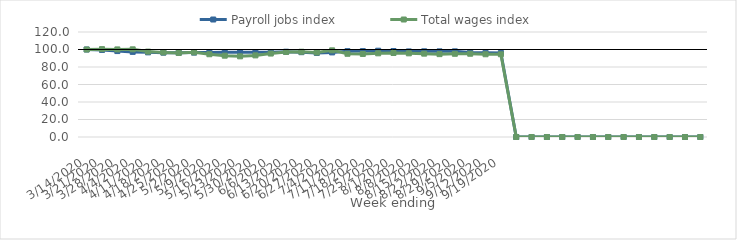
| Category | Payroll jobs index | Total wages index |
|---|---|---|
| 14/03/2020 | 100 | 100 |
| 21/03/2020 | 99.487 | 100.417 |
| 28/03/2020 | 98.197 | 100.093 |
| 04/04/2020 | 97.277 | 100.192 |
| 11/04/2020 | 96.745 | 97.6 |
| 18/04/2020 | 96.396 | 96.702 |
| 25/04/2020 | 96.312 | 96.044 |
| 02/05/2020 | 96.458 | 96.799 |
| 09/05/2020 | 96.589 | 94.574 |
| 16/05/2020 | 96.883 | 92.931 |
| 23/05/2020 | 96.862 | 92.194 |
| 30/05/2020 | 96.874 | 93.276 |
| 06/06/2020 | 96.719 | 95.375 |
| 13/06/2020 | 97.439 | 97.206 |
| 20/06/2020 | 96.939 | 97.433 |
| 27/06/2020 | 96.053 | 96.563 |
| 04/07/2020 | 96.664 | 99.019 |
| 11/07/2020 | 98.11 | 95.103 |
| 18/07/2020 | 98.144 | 94.914 |
| 25/07/2020 | 98.615 | 95.633 |
| 01/08/2020 | 98.276 | 95.995 |
| 08/08/2020 | 97.817 | 95.615 |
| 15/08/2020 | 97.933 | 95.259 |
| 22/08/2020 | 97.867 | 94.699 |
| 29/08/2020 | 97.881 | 95.103 |
| 05/09/2020 | 96.697 | 95.152 |
| 12/09/2020 | 96.238 | 94.571 |
| 19/09/2020 | 96.098 | 94.538 |